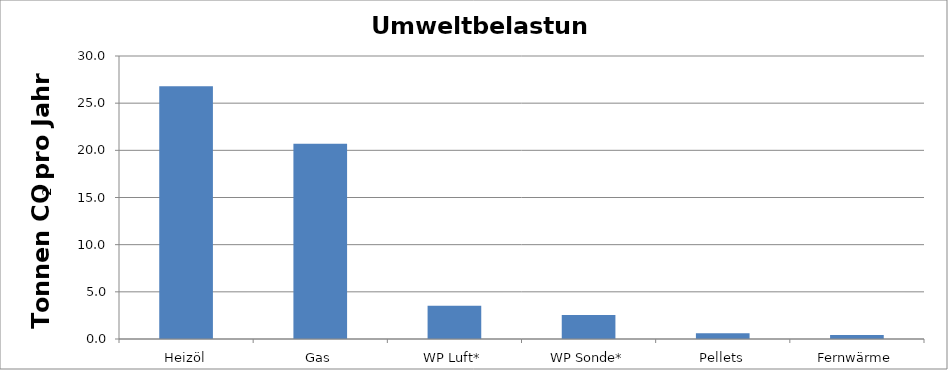
| Category | Fossiles CO2  |
|---|---|
| Heizöl | 26.793 |
| Gas | 20.7 |
| WP Luft* | 3.531 |
| WP Sonde* | 2.55 |
| Pellets | 0.619 |
| Fernwärme | 0.414 |